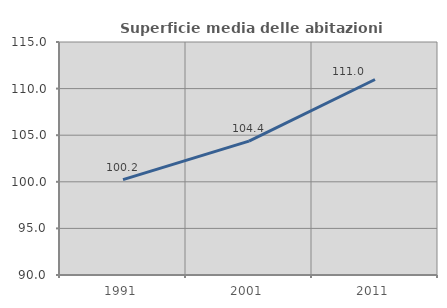
| Category | Superficie media delle abitazioni occupate |
|---|---|
| 1991.0 | 100.238 |
| 2001.0 | 104.36 |
| 2011.0 | 110.975 |